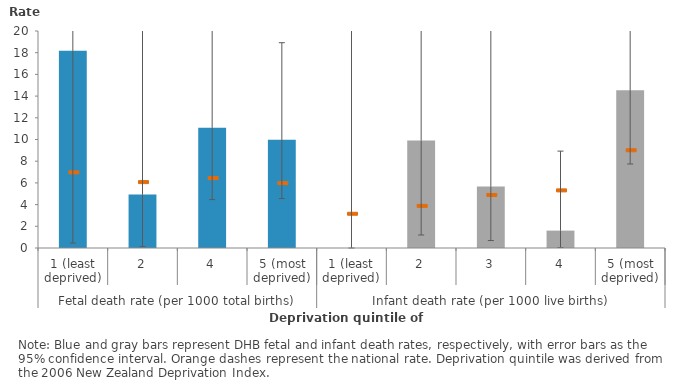
| Category | 1 |
|---|---|
| 0 | 18.182 |
| 1 | 4.926 |
| 2 | 11.094 |
| 3 | 9.967 |
| 4 | 0 |
| 5 | 9.901 |
| 6 | 5.666 |
| 7 | 1.603 |
| 8 | 14.541 |